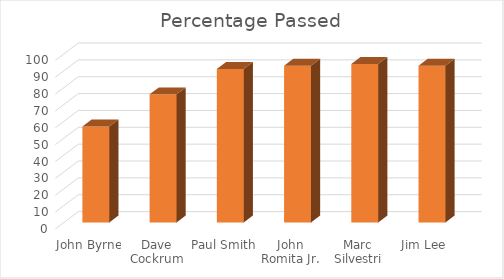
| Category | Percentage Passed |
|---|---|
| John Byrne | 57 |
| Dave Cockrum | 76 |
| Paul Smith | 91 |
| John Romita Jr. | 93 |
| Marc Silvestri | 94 |
| Jim Lee | 93 |